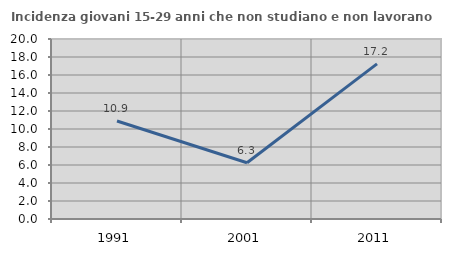
| Category | Incidenza giovani 15-29 anni che non studiano e non lavorano  |
|---|---|
| 1991.0 | 10.887 |
| 2001.0 | 6.25 |
| 2011.0 | 17.241 |